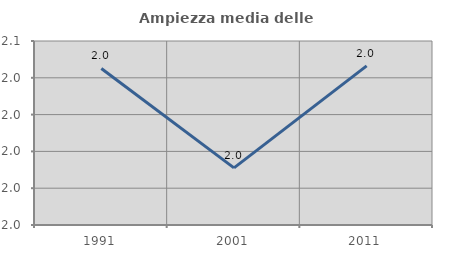
| Category | Ampiezza media delle famiglie |
|---|---|
| 1991.0 | 2.045 |
| 2001.0 | 1.991 |
| 2011.0 | 2.047 |